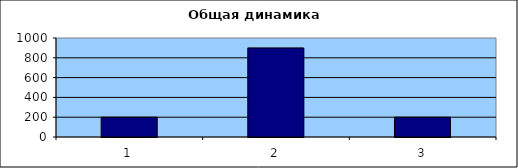
| Category | Series 0 |
|---|---|
| 1 | 200 |
| 2 | 900 |
| 3 | 200 |